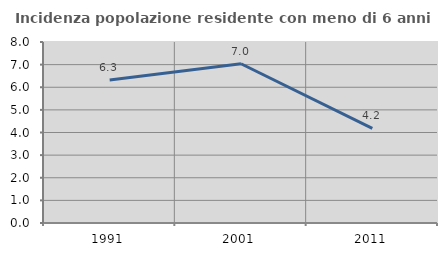
| Category | Incidenza popolazione residente con meno di 6 anni |
|---|---|
| 1991.0 | 6.32 |
| 2001.0 | 7.038 |
| 2011.0 | 4.186 |